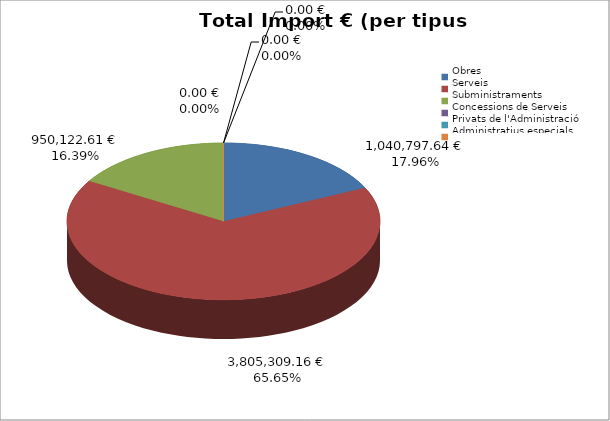
| Category | Total preu
(amb IVA) |
|---|---|
| Obres | 1040797.64 |
| Serveis | 3805309.157 |
| Subministraments | 950122.612 |
| Concessions de Serveis | 0 |
| Privats de l'Administració | 0 |
| Administratius especials | 0 |